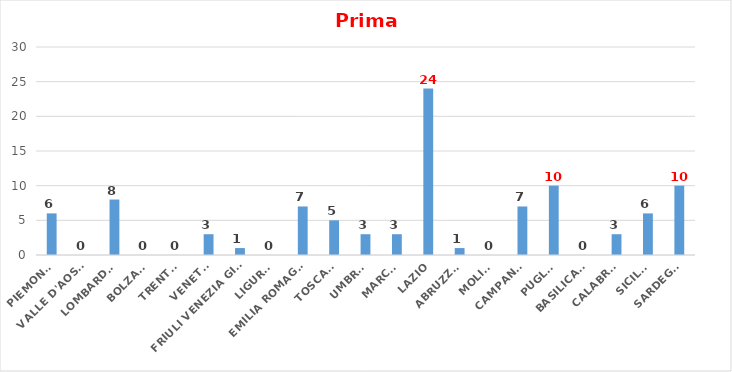
| Category | Series 0 |
|---|---|
| PIEMONTE | 6 |
| VALLE D'AOSTA | 0 |
| LOMBARDIA | 8 |
| BOLZANO | 0 |
| TRENTO | 0 |
| VENETO | 3 |
| FRIULI VENEZIA GIULIA | 1 |
| LIGURIA | 0 |
| EMILIA ROMAGNA | 7 |
| TOSCANA | 5 |
| UMBRIA | 3 |
| MARCHE | 3 |
| LAZIO | 24 |
| ABRUZZO | 1 |
| MOLISE | 0 |
| CAMPANIA | 7 |
| PUGLIA | 10 |
| BASILICATA | 0 |
| CALABRIA | 3 |
| SICILIA | 6 |
| SARDEGNA | 10 |